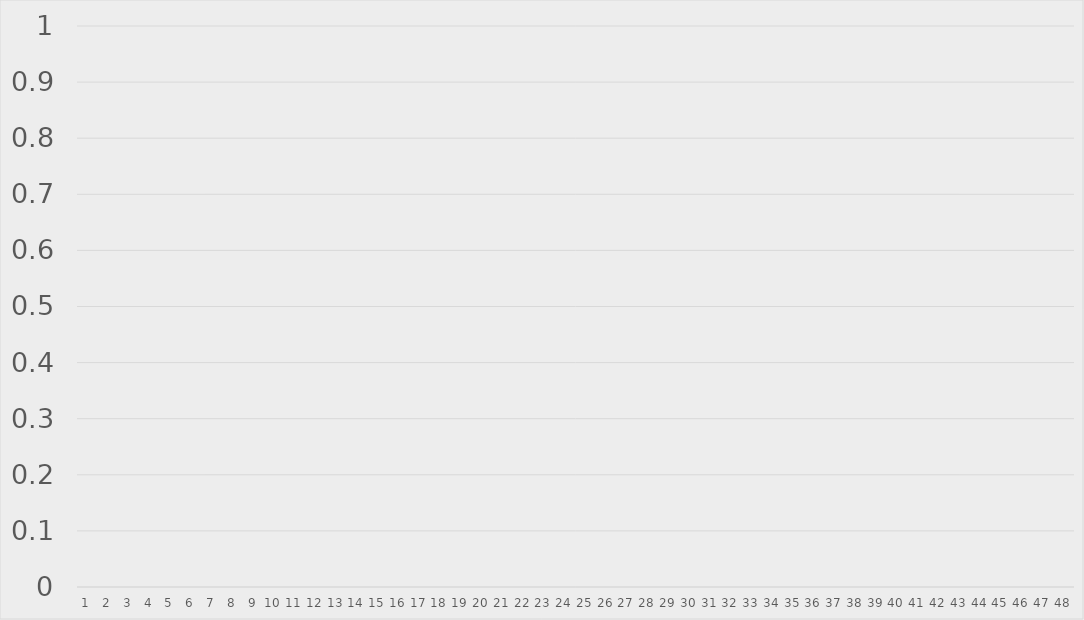
| Category | Series 0 |
|---|---|
| 0 | 0 |
| 1 | 0 |
| 2 | 0 |
| 3 | 0 |
| 4 | 0 |
| 5 | 0 |
| 6 | 0 |
| 7 | 0 |
| 8 | 0 |
| 9 | 0 |
| 10 | 0 |
| 11 | 0 |
| 12 | 0 |
| 13 | 0 |
| 14 | 0 |
| 15 | 0 |
| 16 | 0 |
| 17 | 0 |
| 18 | 0 |
| 19 | 0 |
| 20 | 0 |
| 21 | 0 |
| 22 | 0 |
| 23 | 0 |
| 24 | 0 |
| 25 | 0 |
| 26 | 0 |
| 27 | 0 |
| 28 | 0 |
| 29 | 0 |
| 30 | 0 |
| 31 | 0 |
| 32 | 0 |
| 33 | 0 |
| 34 | 0 |
| 35 | 0 |
| 36 | 0 |
| 37 | 0 |
| 38 | 0 |
| 39 | 0 |
| 40 | 0 |
| 41 | 0 |
| 42 | 0 |
| 43 | 0 |
| 44 | 0 |
| 45 | 0 |
| 46 | 0 |
| 47 | 0 |